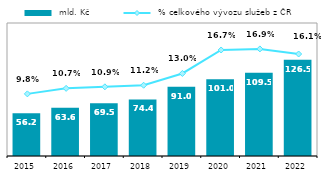
| Category |  mld. Kč |
|---|---|
| 2015.0 | 56.164 |
| 2016.0 | 63.584 |
| 2017.0 | 69.518 |
| 2018.0 | 74.364 |
| 2019.0 | 91 |
| 2020.0 | 101.013 |
| 2021.0 | 109.483 |
| 2022.0 | 126.481 |